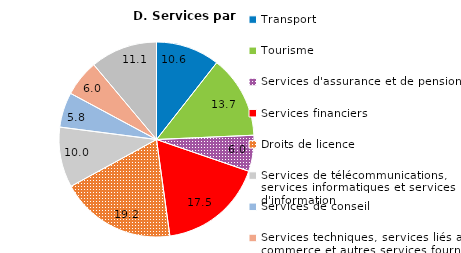
| Category | Exportation de services par secteur |
|---|---|
| Transport |  |
| Tourisme |  |
| Services d'assurance et de pension |  |
| Services financiers |  |
| Droits de licence |  |
| Services de télécommunications, services informatiques et services d'information |  |
| Services de conseil |  |
| Services techniques, services liés au commerce et autres services fournis aux entreprises |  |
| Autres services |  |